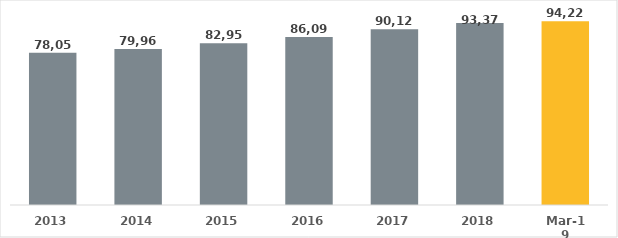
| Category | Series 0 |
|---|---|
| 2013.0 | 78051 |
| 2014.0 | 79961 |
| 2015.0 | 82957 |
| 2016.0 | 86097 |
| 2017.0 | 90125 |
| 2018.0 | 93370 |
| 43525.0 | 94228 |